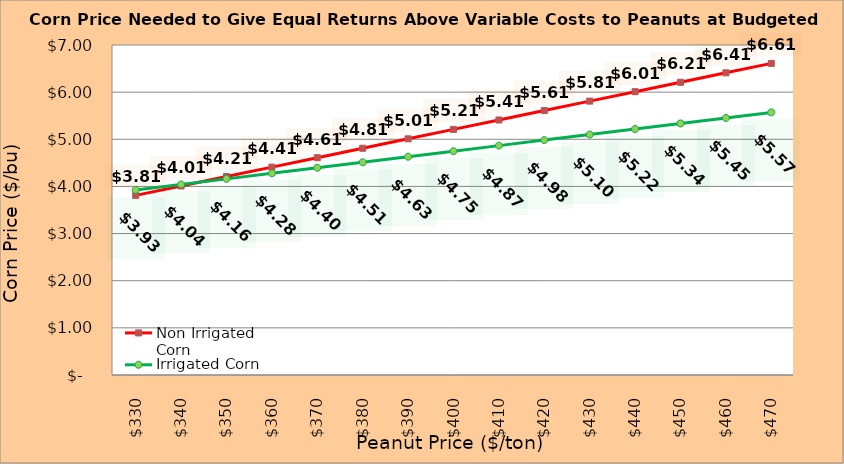
| Category | Non Irrigated Corn | Irrigated Corn |
|---|---|---|
| 330.0 | 3.81 | 3.925 |
| 340.0 | 4.01 | 4.043 |
| 350.0 | 4.21 | 4.16 |
| 360.0 | 4.41 | 4.278 |
| 370.0 | 4.61 | 4.395 |
| 380.0 | 4.81 | 4.513 |
| 390.0 | 5.01 | 4.63 |
| 400.0 | 5.21 | 4.748 |
| 410.0 | 5.41 | 4.865 |
| 420.0 | 5.61 | 4.983 |
| 430.0 | 5.81 | 5.1 |
| 440.0 | 6.01 | 5.218 |
| 450.0 | 6.21 | 5.335 |
| 460.0 | 6.41 | 5.453 |
| 470.0 | 6.61 | 5.57 |